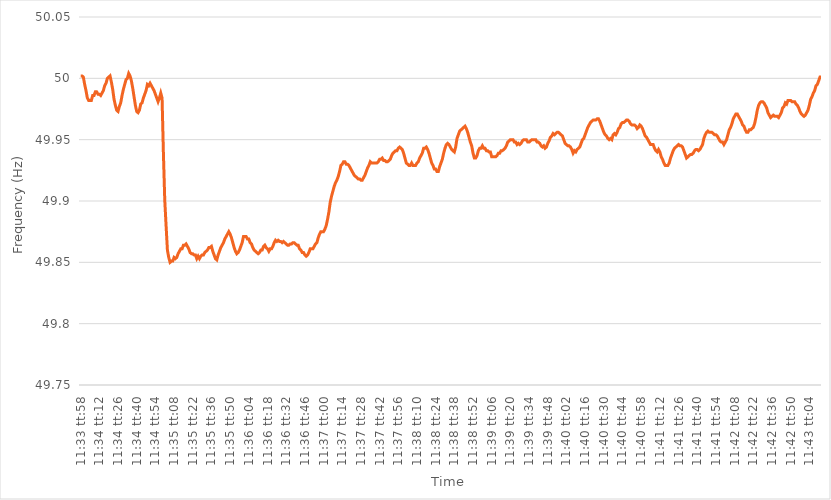
| Category | Series 0 |
|---|---|
| 0.48192129629629626 | 50.002 |
| 0.4819328703703704 | 50.002 |
| 0.48194444444444445 | 50.001 |
| 0.48195601851851855 | 49.995 |
| 0.4819675925925926 | 49.99 |
| 0.4819791666666667 | 49.984 |
| 0.4819907407407407 | 49.982 |
| 0.48200231481481487 | 49.982 |
| 0.4820138888888889 | 49.982 |
| 0.48202546296296295 | 49.986 |
| 0.48203703703703704 | 49.986 |
| 0.4820486111111111 | 49.989 |
| 0.4820601851851852 | 49.989 |
| 0.4820717592592592 | 49.987 |
| 0.48208333333333336 | 49.987 |
| 0.4820949074074074 | 49.986 |
| 0.4821064814814815 | 49.988 |
| 0.48211805555555554 | 49.99 |
| 0.48212962962962963 | 49.994 |
| 0.48214120370370367 | 49.996 |
| 0.4821527777777778 | 50 |
| 0.48216435185185186 | 50.001 |
| 0.48217592592592595 | 50.002 |
| 0.4821875 | 49.997 |
| 0.4821990740740741 | 49.991 |
| 0.4822106481481481 | 49.983 |
| 0.4822222222222223 | 49.978 |
| 0.4822337962962963 | 49.974 |
| 0.48224537037037035 | 49.973 |
| 0.48225694444444445 | 49.977 |
| 0.4822685185185185 | 49.98 |
| 0.4822800925925926 | 49.986 |
| 0.4822916666666666 | 49.991 |
| 0.48230324074074077 | 49.995 |
| 0.4823148148148148 | 49.999 |
| 0.4823263888888889 | 50 |
| 0.48233796296296294 | 50.004 |
| 0.48234953703703703 | 50.002 |
| 0.4823611111111111 | 49.998 |
| 0.4823726851851852 | 49.992 |
| 0.48238425925925926 | 49.985 |
| 0.48239583333333336 | 49.978 |
| 0.4824074074074074 | 49.973 |
| 0.4824189814814815 | 49.972 |
| 0.48243055555555553 | 49.974 |
| 0.4824421296296297 | 49.979 |
| 0.4824537037037037 | 49.98 |
| 0.4824652777777778 | 49.984 |
| 0.48247685185185185 | 49.987 |
| 0.4824884259259259 | 49.99 |
| 0.4825 | 49.995 |
| 0.482511574074074 | 49.994 |
| 0.4825231481481482 | 49.996 |
| 0.4825347222222222 | 49.994 |
| 0.4825462962962963 | 49.992 |
| 0.48255787037037035 | 49.99 |
| 0.48256944444444444 | 49.987 |
| 0.4825810185185185 | 49.984 |
| 0.48259259259259263 | 49.981 |
| 0.48260416666666667 | 49.984 |
| 0.48261574074074076 | 49.988 |
| 0.4826273148148148 | 49.984 |
| 0.4826388888888889 | 49.939 |
| 0.48265046296296293 | 49.901 |
| 0.4826620370370371 | 49.88 |
| 0.4826736111111111 | 49.86 |
| 0.4826851851851852 | 49.854 |
| 0.48269675925925926 | 49.85 |
| 0.48270833333333335 | 49.851 |
| 0.4827199074074074 | 49.851 |
| 0.48273148148148143 | 49.854 |
| 0.4827430555555556 | 49.853 |
| 0.4827546296296296 | 49.854 |
| 0.4827662037037037 | 49.857 |
| 0.48277777777777775 | 49.859 |
| 0.48278935185185184 | 49.861 |
| 0.4828009259259259 | 49.861 |
| 0.48281250000000003 | 49.864 |
| 0.48282407407407407 | 49.864 |
| 0.48283564814814817 | 49.865 |
| 0.4828472222222222 | 49.863 |
| 0.4828587962962963 | 49.861 |
| 0.48287037037037034 | 49.858 |
| 0.4828819444444445 | 49.857 |
| 0.4828935185185185 | 49.857 |
| 0.4829050925925926 | 49.856 |
| 0.48291666666666666 | 49.856 |
| 0.48292824074074076 | 49.853 |
| 0.4829398148148148 | 49.855 |
| 0.48295138888888894 | 49.853 |
| 0.482962962962963 | 49.855 |
| 0.482974537037037 | 49.856 |
| 0.4829861111111111 | 49.856 |
| 0.48299768518518515 | 49.858 |
| 0.48300925925925925 | 49.859 |
| 0.4830208333333333 | 49.86 |
| 0.48303240740740744 | 49.862 |
| 0.4830439814814815 | 49.862 |
| 0.48305555555555557 | 49.863 |
| 0.4830671296296296 | 49.859 |
| 0.4830787037037037 | 49.856 |
| 0.48309027777777774 | 49.853 |
| 0.4831018518518519 | 49.852 |
| 0.48311342592592593 | 49.856 |
| 0.483125 | 49.859 |
| 0.48313657407407407 | 49.862 |
| 0.48314814814814816 | 49.864 |
| 0.4831597222222222 | 49.866 |
| 0.48317129629629635 | 49.869 |
| 0.4831828703703704 | 49.871 |
| 0.4831944444444444 | 49.873 |
| 0.4832060185185185 | 49.875 |
| 0.48321759259259256 | 49.873 |
| 0.48322916666666665 | 49.87 |
| 0.4832407407407407 | 49.866 |
| 0.48325231481481484 | 49.862 |
| 0.4832638888888889 | 49.859 |
| 0.483275462962963 | 49.857 |
| 0.483287037037037 | 49.858 |
| 0.4832986111111111 | 49.86 |
| 0.48331018518518515 | 49.863 |
| 0.4833217592592593 | 49.866 |
| 0.48333333333333334 | 49.871 |
| 0.48334490740740743 | 49.871 |
| 0.48335648148148147 | 49.871 |
| 0.48336805555555556 | 49.869 |
| 0.4833796296296296 | 49.869 |
| 0.48339120370370375 | 49.866 |
| 0.4834027777777778 | 49.865 |
| 0.4834143518518519 | 49.862 |
| 0.4834259259259259 | 49.86 |
| 0.48343749999999996 | 49.859 |
| 0.48344907407407406 | 49.858 |
| 0.4834606481481481 | 49.857 |
| 0.48347222222222225 | 49.858 |
| 0.4834837962962963 | 49.86 |
| 0.4834953703703704 | 49.86 |
| 0.4835069444444444 | 49.863 |
| 0.4835185185185185 | 49.864 |
| 0.48353009259259255 | 49.862 |
| 0.4835416666666667 | 49.861 |
| 0.48355324074074074 | 49.859 |
| 0.48356481481481484 | 49.861 |
| 0.4835763888888889 | 49.861 |
| 0.48358796296296297 | 49.863 |
| 0.483599537037037 | 49.866 |
| 0.48361111111111116 | 49.868 |
| 0.4836226851851852 | 49.867 |
| 0.4836342592592593 | 49.868 |
| 0.48364583333333333 | 49.867 |
| 0.4836574074074074 | 49.867 |
| 0.48366898148148146 | 49.866 |
| 0.4836805555555555 | 49.867 |
| 0.48369212962962965 | 49.866 |
| 0.4837037037037037 | 49.865 |
| 0.4837152777777778 | 49.864 |
| 0.4837268518518518 | 49.864 |
| 0.4837384259259259 | 49.865 |
| 0.48374999999999996 | 49.865 |
| 0.4837615740740741 | 49.866 |
| 0.48377314814814815 | 49.866 |
| 0.48378472222222224 | 49.865 |
| 0.4837962962962963 | 49.864 |
| 0.4838078703703704 | 49.864 |
| 0.4838194444444444 | 49.861 |
| 0.48383101851851856 | 49.86 |
| 0.4838425925925926 | 49.858 |
| 0.4838541666666667 | 49.858 |
| 0.48386574074074074 | 49.856 |
| 0.48387731481481483 | 49.855 |
| 0.48388888888888887 | 49.856 |
| 0.483900462962963 | 49.858 |
| 0.48391203703703706 | 49.861 |
| 0.4839236111111111 | 49.861 |
| 0.4839351851851852 | 49.861 |
| 0.48394675925925923 | 49.863 |
| 0.4839583333333333 | 49.865 |
| 0.48396990740740736 | 49.866 |
| 0.4839814814814815 | 49.87 |
| 0.48399305555555555 | 49.873 |
| 0.48400462962962965 | 49.875 |
| 0.4840162037037037 | 49.875 |
| 0.4840277777777778 | 49.875 |
| 0.4840393518518518 | 49.877 |
| 0.48405092592592597 | 49.88 |
| 0.4840625 | 49.885 |
| 0.4840740740740741 | 49.891 |
| 0.48408564814814814 | 49.899 |
| 0.48409722222222223 | 49.904 |
| 0.4841087962962963 | 49.908 |
| 0.4841203703703704 | 49.912 |
| 0.48413194444444446 | 49.915 |
| 0.4841435185185185 | 49.917 |
| 0.4841550925925926 | 49.92 |
| 0.48416666666666663 | 49.924 |
| 0.48417824074074073 | 49.929 |
| 0.48418981481481477 | 49.93 |
| 0.4842013888888889 | 49.932 |
| 0.48421296296296296 | 49.932 |
| 0.48422453703703705 | 49.93 |
| 0.4842361111111111 | 49.93 |
| 0.4842476851851852 | 49.929 |
| 0.4842592592592592 | 49.927 |
| 0.4842708333333334 | 49.925 |
| 0.4842824074074074 | 49.923 |
| 0.4842939814814815 | 49.921 |
| 0.48430555555555554 | 49.92 |
| 0.48431712962962964 | 49.919 |
| 0.4843287037037037 | 49.918 |
| 0.48434027777777783 | 49.918 |
| 0.48435185185185187 | 49.917 |
| 0.48436342592592596 | 49.917 |
| 0.484375 | 49.919 |
| 0.48438657407407404 | 49.921 |
| 0.48439814814814813 | 49.924 |
| 0.48440972222222217 | 49.927 |
| 0.4844212962962963 | 49.929 |
| 0.48443287037037036 | 49.932 |
| 0.48444444444444446 | 49.931 |
| 0.4844560185185185 | 49.931 |
| 0.4844675925925926 | 49.931 |
| 0.4844791666666666 | 49.931 |
| 0.4844907407407408 | 49.931 |
| 0.4845023148148148 | 49.932 |
| 0.4845138888888889 | 49.934 |
| 0.48452546296296295 | 49.934 |
| 0.48453703703703704 | 49.935 |
| 0.4845486111111111 | 49.933 |
| 0.48456018518518523 | 49.933 |
| 0.48457175925925927 | 49.932 |
| 0.48458333333333337 | 49.932 |
| 0.4845949074074074 | 49.933 |
| 0.4846064814814815 | 49.934 |
| 0.48461805555555554 | 49.937 |
| 0.4846296296296296 | 49.939 |
| 0.4846412037037037 | 49.94 |
| 0.48465277777777777 | 49.941 |
| 0.48466435185185186 | 49.941 |
| 0.4846759259259259 | 49.943 |
| 0.4846875 | 49.944 |
| 0.48469907407407403 | 49.943 |
| 0.4847106481481482 | 49.942 |
| 0.4847222222222222 | 49.939 |
| 0.4847337962962963 | 49.935 |
| 0.48474537037037035 | 49.931 |
| 0.48475694444444445 | 49.93 |
| 0.4847685185185185 | 49.929 |
| 0.48478009259259264 | 49.929 |
| 0.4847916666666667 | 49.931 |
| 0.48480324074074077 | 49.929 |
| 0.4848148148148148 | 49.929 |
| 0.4848263888888889 | 49.929 |
| 0.48483796296296294 | 49.931 |
| 0.484849537037037 | 49.932 |
| 0.48486111111111113 | 49.935 |
| 0.48487268518518517 | 49.937 |
| 0.48488425925925926 | 49.939 |
| 0.4848958333333333 | 49.943 |
| 0.4849074074074074 | 49.943 |
| 0.48491898148148144 | 49.944 |
| 0.4849305555555556 | 49.942 |
| 0.4849421296296296 | 49.939 |
| 0.4849537037037037 | 49.935 |
| 0.48496527777777776 | 49.931 |
| 0.48497685185185185 | 49.929 |
| 0.4849884259259259 | 49.926 |
| 0.48500000000000004 | 49.926 |
| 0.4850115740740741 | 49.924 |
| 0.4850231481481482 | 49.924 |
| 0.4850347222222222 | 49.928 |
| 0.4850462962962963 | 49.931 |
| 0.48505787037037035 | 49.934 |
| 0.4850694444444445 | 49.939 |
| 0.48508101851851854 | 49.943 |
| 0.4850925925925926 | 49.946 |
| 0.48510416666666667 | 49.947 |
| 0.4851157407407407 | 49.946 |
| 0.4851273148148148 | 49.944 |
| 0.48513888888888884 | 49.942 |
| 0.485150462962963 | 49.941 |
| 0.48516203703703703 | 49.94 |
| 0.4851736111111111 | 49.944 |
| 0.48518518518518516 | 49.951 |
| 0.48519675925925926 | 49.954 |
| 0.4852083333333333 | 49.957 |
| 0.48521990740740745 | 49.958 |
| 0.4852314814814815 | 49.959 |
| 0.4852430555555556 | 49.96 |
| 0.4852546296296296 | 49.961 |
| 0.4852662037037037 | 49.959 |
| 0.48527777777777775 | 49.956 |
| 0.4852893518518519 | 49.952 |
| 0.48530092592592594 | 49.948 |
| 0.48531250000000004 | 49.945 |
| 0.4853240740740741 | 49.939 |
| 0.4853356481481481 | 49.935 |
| 0.4853472222222222 | 49.935 |
| 0.48535879629629625 | 49.937 |
| 0.4853703703703704 | 49.941 |
| 0.48538194444444444 | 49.943 |
| 0.48539351851851853 | 49.943 |
| 0.48540509259259257 | 49.945 |
| 0.48541666666666666 | 49.943 |
| 0.4854282407407407 | 49.943 |
| 0.48543981481481485 | 49.941 |
| 0.4854513888888889 | 49.941 |
| 0.485462962962963 | 49.94 |
| 0.485474537037037 | 49.94 |
| 0.4854861111111111 | 49.936 |
| 0.48549768518518516 | 49.936 |
| 0.4855092592592593 | 49.936 |
| 0.48552083333333335 | 49.936 |
| 0.48553240740740744 | 49.937 |
| 0.4855439814814815 | 49.939 |
| 0.4855555555555556 | 49.939 |
| 0.4855671296296296 | 49.941 |
| 0.48557870370370365 | 49.941 |
| 0.4855902777777778 | 49.942 |
| 0.48560185185185184 | 49.943 |
| 0.48561342592592593 | 49.945 |
| 0.485625 | 49.948 |
| 0.48563657407407407 | 49.949 |
| 0.4856481481481481 | 49.95 |
| 0.48565972222222226 | 49.95 |
| 0.4856712962962963 | 49.95 |
| 0.4856828703703704 | 49.948 |
| 0.48569444444444443 | 49.948 |
| 0.4857060185185185 | 49.946 |
| 0.48571759259259256 | 49.947 |
| 0.4857291666666667 | 49.946 |
| 0.48574074074074075 | 49.947 |
| 0.48575231481481485 | 49.949 |
| 0.4857638888888889 | 49.95 |
| 0.485775462962963 | 49.95 |
| 0.485787037037037 | 49.95 |
| 0.48579861111111106 | 49.948 |
| 0.4858101851851852 | 49.948 |
| 0.48582175925925924 | 49.949 |
| 0.48583333333333334 | 49.95 |
| 0.4858449074074074 | 49.95 |
| 0.4858564814814815 | 49.95 |
| 0.4858680555555555 | 49.95 |
| 0.48587962962962966 | 49.948 |
| 0.4858912037037037 | 49.948 |
| 0.4859027777777778 | 49.947 |
| 0.48591435185185183 | 49.945 |
| 0.48592592592592593 | 49.944 |
| 0.48593749999999997 | 49.945 |
| 0.4859490740740741 | 49.943 |
| 0.48596064814814816 | 49.944 |
| 0.48597222222222225 | 49.947 |
| 0.4859837962962963 | 49.949 |
| 0.4859953703703704 | 49.952 |
| 0.4860069444444444 | 49.953 |
| 0.48601851851851857 | 49.955 |
| 0.4860300925925926 | 49.954 |
| 0.48604166666666665 | 49.955 |
| 0.48605324074074074 | 49.956 |
| 0.4860648148148148 | 49.956 |
| 0.4860763888888889 | 49.955 |
| 0.4860879629629629 | 49.954 |
| 0.48609953703703707 | 49.953 |
| 0.4861111111111111 | 49.95 |
| 0.4861226851851852 | 49.947 |
| 0.48613425925925924 | 49.946 |
| 0.48614583333333333 | 49.945 |
| 0.48615740740740737 | 49.945 |
| 0.4861689814814815 | 49.944 |
| 0.48618055555555556 | 49.942 |
| 0.48619212962962965 | 49.939 |
| 0.4862037037037037 | 49.941 |
| 0.4862152777777778 | 49.94 |
| 0.4862268518518518 | 49.942 |
| 0.486238425925926 | 49.943 |
| 0.48625 | 49.944 |
| 0.4862615740740741 | 49.947 |
| 0.48627314814814815 | 49.95 |
| 0.4862847222222222 | 49.951 |
| 0.4862962962962963 | 49.954 |
| 0.4863078703703703 | 49.957 |
| 0.48631944444444447 | 49.96 |
| 0.4863310185185185 | 49.962 |
| 0.4863425925925926 | 49.964 |
| 0.48635416666666664 | 49.965 |
| 0.48636574074074074 | 49.966 |
| 0.4863773148148148 | 49.966 |
| 0.4863888888888889 | 49.966 |
| 0.48640046296296297 | 49.967 |
| 0.48641203703703706 | 49.967 |
| 0.4864236111111111 | 49.965 |
| 0.4864351851851852 | 49.962 |
| 0.48644675925925923 | 49.959 |
| 0.4864583333333334 | 49.956 |
| 0.4864699074074074 | 49.954 |
| 0.4864814814814815 | 49.953 |
| 0.48649305555555555 | 49.951 |
| 0.48650462962962965 | 49.95 |
| 0.4865162037037037 | 49.951 |
| 0.4865277777777777 | 49.95 |
| 0.4865393518518519 | 49.954 |
| 0.4865509259259259 | 49.955 |
| 0.4865625 | 49.954 |
| 0.48657407407407405 | 49.956 |
| 0.48658564814814814 | 49.959 |
| 0.4865972222222222 | 49.96 |
| 0.48660879629629633 | 49.963 |
| 0.48662037037037037 | 49.964 |
| 0.48663194444444446 | 49.964 |
| 0.4866435185185185 | 49.965 |
| 0.4866550925925926 | 49.966 |
| 0.48666666666666664 | 49.966 |
| 0.4866782407407408 | 49.965 |
| 0.4866898148148148 | 49.963 |
| 0.4867013888888889 | 49.962 |
| 0.48671296296296296 | 49.962 |
| 0.48672453703703705 | 49.962 |
| 0.4867361111111111 | 49.961 |
| 0.48674768518518513 | 49.959 |
| 0.4867592592592593 | 49.96 |
| 0.4867708333333333 | 49.962 |
| 0.4867824074074074 | 49.961 |
| 0.48679398148148145 | 49.959 |
| 0.48680555555555555 | 49.956 |
| 0.4868171296296296 | 49.953 |
| 0.48682870370370374 | 49.952 |
| 0.4868402777777778 | 49.95 |
| 0.48685185185185187 | 49.948 |
| 0.4868634259259259 | 49.946 |
| 0.486875 | 49.946 |
| 0.48688657407407404 | 49.946 |
| 0.4868981481481482 | 49.943 |
| 0.48690972222222223 | 49.941 |
| 0.4869212962962963 | 49.94 |
| 0.48693287037037036 | 49.942 |
| 0.48694444444444446 | 49.94 |
| 0.4869560185185185 | 49.936 |
| 0.48696759259259265 | 49.934 |
| 0.4869791666666667 | 49.931 |
| 0.4869907407407407 | 49.929 |
| 0.4870023148148148 | 49.929 |
| 0.48701388888888886 | 49.929 |
| 0.48702546296296295 | 49.931 |
| 0.487037037037037 | 49.935 |
| 0.48704861111111114 | 49.938 |
| 0.4870601851851852 | 49.941 |
| 0.4870717592592593 | 49.943 |
| 0.4870833333333333 | 49.944 |
| 0.4870949074074074 | 49.945 |
| 0.48710648148148145 | 49.946 |
| 0.4871180555555556 | 49.945 |
| 0.48712962962962963 | 49.945 |
| 0.48714120370370373 | 49.944 |
| 0.48715277777777777 | 49.941 |
| 0.48716435185185186 | 49.938 |
| 0.4871759259259259 | 49.935 |
| 0.48718750000000005 | 49.936 |
| 0.4871990740740741 | 49.937 |
| 0.4872106481481482 | 49.938 |
| 0.4872222222222222 | 49.938 |
| 0.48723379629629626 | 49.939 |
| 0.48724537037037036 | 49.941 |
| 0.4872569444444444 | 49.942 |
| 0.48726851851851855 | 49.942 |
| 0.4872800925925926 | 49.941 |
| 0.4872916666666667 | 49.942 |
| 0.4873032407407407 | 49.944 |
| 0.4873148148148148 | 49.946 |
| 0.48732638888888885 | 49.951 |
| 0.487337962962963 | 49.954 |
| 0.48734953703703704 | 49.956 |
| 0.48736111111111113 | 49.957 |
| 0.4873726851851852 | 49.956 |
| 0.48738425925925927 | 49.956 |
| 0.4873958333333333 | 49.956 |
| 0.48740740740740746 | 49.955 |
| 0.4874189814814815 | 49.954 |
| 0.4874305555555556 | 49.954 |
| 0.48744212962962963 | 49.953 |
| 0.48745370370370367 | 49.951 |
| 0.48746527777777776 | 49.949 |
| 0.4874768518518518 | 49.948 |
| 0.48748842592592595 | 49.948 |
| 0.4875 | 49.946 |
| 0.4875115740740741 | 49.948 |
| 0.4875231481481481 | 49.95 |
| 0.4875347222222222 | 49.954 |
| 0.48754629629629626 | 49.958 |
| 0.4875578703703704 | 49.96 |
| 0.48756944444444444 | 49.963 |
| 0.48758101851851854 | 49.967 |
| 0.4875925925925926 | 49.969 |
| 0.48760416666666667 | 49.971 |
| 0.4876157407407407 | 49.971 |
| 0.48762731481481486 | 49.969 |
| 0.4876388888888889 | 49.967 |
| 0.487650462962963 | 49.965 |
| 0.48766203703703703 | 49.962 |
| 0.4876736111111111 | 49.961 |
| 0.48768518518518517 | 49.958 |
| 0.4876967592592592 | 49.956 |
| 0.48770833333333335 | 49.956 |
| 0.4877199074074074 | 49.958 |
| 0.4877314814814815 | 49.958 |
| 0.4877430555555555 | 49.959 |
| 0.4877546296296296 | 49.96 |
| 0.48776620370370366 | 49.963 |
| 0.4877777777777778 | 49.968 |
| 0.48778935185185185 | 49.974 |
| 0.48780092592592594 | 49.978 |
| 0.4878125 | 49.98 |
| 0.4878240740740741 | 49.981 |
| 0.4878356481481481 | 49.981 |
| 0.48784722222222227 | 49.98 |
| 0.4878587962962963 | 49.978 |
| 0.4878703703703704 | 49.976 |
| 0.48788194444444444 | 49.972 |
| 0.48789351851851853 | 49.97 |
| 0.48790509259259257 | 49.968 |
| 0.4879166666666667 | 49.969 |
| 0.48792824074074076 | 49.97 |
| 0.4879398148148148 | 49.969 |
| 0.4879513888888889 | 49.969 |
| 0.48796296296296293 | 49.969 |
| 0.487974537037037 | 49.968 |
| 0.48798611111111106 | 49.97 |
| 0.4879976851851852 | 49.972 |
| 0.48800925925925925 | 49.976 |
| 0.48802083333333335 | 49.977 |
| 0.4880324074074074 | 49.98 |
| 0.4880439814814815 | 49.979 |
| 0.4880555555555555 | 49.982 |
| 0.48806712962962967 | 49.982 |
| 0.4880787037037037 | 49.982 |
| 0.4880902777777778 | 49.981 |
| 0.48810185185185184 | 49.981 |
| 0.48811342592592594 | 49.981 |
| 0.488125 | 49.979 |
| 0.4881365740740741 | 49.978 |
| 0.48814814814814816 | 49.976 |
| 0.48815972222222226 | 49.973 |
| 0.4881712962962963 | 49.971 |
| 0.48818287037037034 | 49.97 |
| 0.48819444444444443 | 49.969 |
| 0.48820601851851847 | 49.97 |
| 0.4882175925925926 | 49.972 |
| 0.48822916666666666 | 49.974 |
| 0.48824074074074075 | 49.978 |
| 0.4882523148148148 | 49.983 |
| 0.4882638888888889 | 49.985 |
| 0.4882754629629629 | 49.988 |
| 0.4882870370370371 | 49.99 |
| 0.4882986111111111 | 49.994 |
| 0.4883101851851852 | 49.995 |
| 0.48832175925925925 | 49.998 |
| 0.48833333333333334 | 50.001 |
| 0.4883449074074074 | 50.001 |